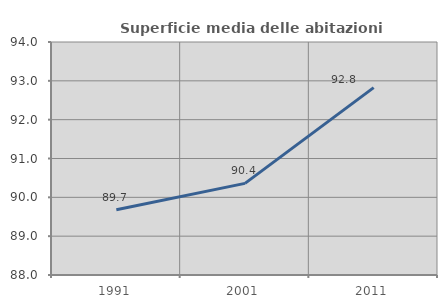
| Category | Superficie media delle abitazioni occupate |
|---|---|
| 1991.0 | 89.68 |
| 2001.0 | 90.359 |
| 2011.0 | 92.825 |